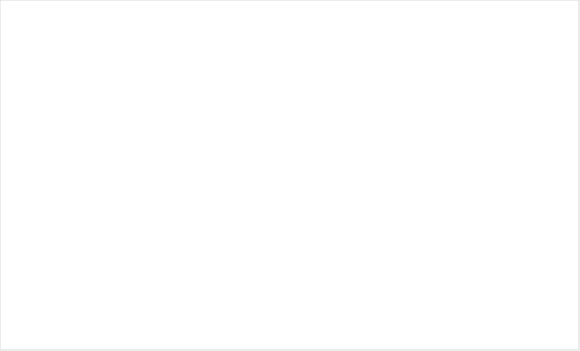
| Category | Итог |
|---|---|
| Так | 13 |
| Частково | 3 |